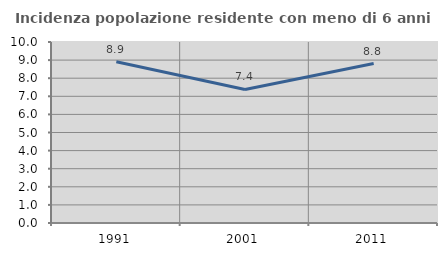
| Category | Incidenza popolazione residente con meno di 6 anni |
|---|---|
| 1991.0 | 8.912 |
| 2001.0 | 7.379 |
| 2011.0 | 8.812 |